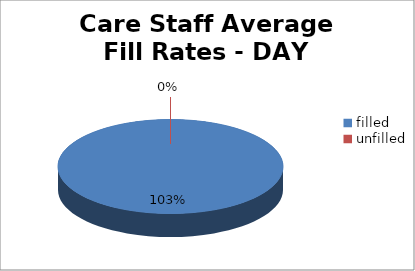
| Category | Series 0 |
|---|---|
| filled | 103 |
| unfilled | 0 |